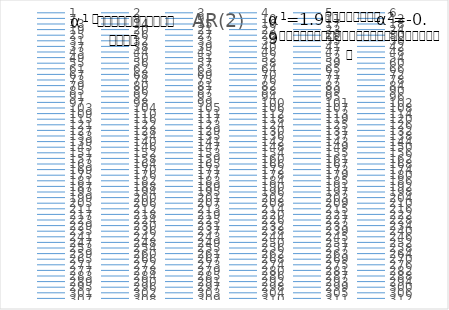
| Category | AR(2)  |
|---|---|
| 0 | 0 |
| 1 | 1.015 |
| 2 | 3.507 |
| 3 | 5.76 |
| 4 | 7.894 |
| 5 | 9.936 |
| 6 | 12.89 |
| 7 | 18.199 |
| 8 | 23.884 |
| 9 | 28.927 |
| 10 | 33.18 |
| 11 | 38.43 |
| 12 | 43.769 |
| 13 | 50.623 |
| 14 | 56.147 |
| 15 | 61.896 |
| 16 | 67.135 |
| 17 | 72.353 |
| 18 | 78.181 |
| 19 | 84.685 |
| 20 | 89.656 |
| 21 | 94.512 |
| 22 | 100.489 |
| 23 | 106.891 |
| 24 | 112.154 |
| 25 | 116.069 |
| 26 | 119.767 |
| 27 | 122.685 |
| 28 | 124.384 |
| 29 | 125.669 |
| 30 | 126.126 |
| 31 | 127.454 |
| 32 | 127.619 |
| 33 | 128.554 |
| 34 | 127.855 |
| 35 | 127.74 |
| 36 | 127.089 |
| 37 | 126.334 |
| 38 | 125.894 |
| 39 | 124.434 |
| 40 | 123.524 |
| 41 | 122.55 |
| 42 | 122.562 |
| 43 | 122.97 |
| 44 | 121.533 |
| 45 | 119.502 |
| 46 | 118.071 |
| 47 | 117.472 |
| 48 | 116.768 |
| 49 | 116.276 |
| 50 | 115.43 |
| 51 | 115.498 |
| 52 | 113.663 |
| 53 | 112.455 |
| 54 | 109.128 |
| 55 | 104.153 |
| 56 | 100.426 |
| 57 | 97.573 |
| 58 | 94.002 |
| 59 | 91.113 |
| 60 | 88.67 |
| 61 | 86.404 |
| 62 | 84.734 |
| 63 | 83.821 |
| 64 | 83.943 |
| 65 | 85.043 |
| 66 | 84.378 |
| 67 | 83.54 |
| 68 | 83.214 |
| 69 | 84.386 |
| 70 | 85.411 |
| 71 | 88.765 |
| 72 | 90.128 |
| 73 | 93.767 |
| 74 | 99.591 |
| 75 | 104.199 |
| 76 | 106.82 |
| 77 | 107.725 |
| 78 | 106.442 |
| 79 | 104.34 |
| 80 | 102.053 |
| 81 | 99.024 |
| 82 | 97.731 |
| 83 | 95.042 |
| 84 | 91.327 |
| 85 | 87.973 |
| 86 | 83.709 |
| 87 | 78.466 |
| 88 | 73.391 |
| 89 | 68.042 |
| 90 | 61.665 |
| 91 | 53.948 |
| 92 | 46.795 |
| 93 | 40.251 |
| 94 | 33.421 |
| 95 | 27.787 |
| 96 | 24.186 |
| 97 | 22.78 |
| 98 | 22.776 |
| 99 | 24.572 |
| 100 | 26.758 |
| 101 | 29.098 |
| 102 | 31.639 |
| 103 | 33.796 |
| 104 | 36.909 |
| 105 | 41.614 |
| 106 | 44.584 |
| 107 | 46.011 |
| 108 | 47.927 |
| 109 | 49.825 |
| 110 | 51.578 |
| 111 | 53.433 |
| 112 | 55.891 |
| 113 | 59.281 |
| 114 | 62.076 |
| 115 | 65.302 |
| 116 | 67.224 |
| 117 | 69.526 |
| 118 | 72.764 |
| 119 | 76.273 |
| 120 | 79.911 |
| 121 | 83.338 |
| 122 | 85.599 |
| 123 | 88.963 |
| 124 | 91.87 |
| 125 | 94.437 |
| 126 | 96.654 |
| 127 | 98.175 |
| 128 | 99.149 |
| 129 | 99.413 |
| 130 | 100.536 |
| 131 | 100.868 |
| 132 | 99.943 |
| 133 | 99.39 |
| 134 | 97.702 |
| 135 | 94.4 |
| 136 | 90.994 |
| 137 | 88.534 |
| 138 | 85.911 |
| 139 | 81.891 |
| 140 | 79.52 |
| 141 | 77.993 |
| 142 | 77.404 |
| 143 | 76.795 |
| 144 | 76.27 |
| 145 | 75.298 |
| 146 | 73.188 |
| 147 | 71.844 |
| 148 | 71.333 |
| 149 | 71.709 |
| 150 | 73.015 |
| 151 | 74.381 |
| 152 | 75.384 |
| 153 | 77.317 |
| 154 | 79.85 |
| 155 | 83.029 |
| 156 | 86.758 |
| 157 | 90.866 |
| 158 | 94.392 |
| 159 | 98.268 |
| 160 | 101.868 |
| 161 | 105.644 |
| 162 | 108.127 |
| 163 | 111.269 |
| 164 | 114.104 |
| 165 | 117.283 |
| 166 | 119.188 |
| 167 | 122.675 |
| 168 | 126.977 |
| 169 | 129.845 |
| 170 | 132.157 |
| 171 | 133.514 |
| 172 | 133.873 |
| 173 | 134.194 |
| 174 | 132.926 |
| 175 | 130.418 |
| 176 | 126.799 |
| 177 | 124.7 |
| 178 | 121.036 |
| 179 | 117.263 |
| 180 | 113.37 |
| 181 | 110.784 |
| 182 | 106.826 |
| 183 | 103.114 |
| 184 | 99.576 |
| 185 | 95.691 |
| 186 | 91.425 |
| 187 | 87.54 |
| 188 | 84.85 |
| 189 | 82.072 |
| 190 | 78.33 |
| 191 | 75.241 |
| 192 | 73.433 |
| 193 | 72.63 |
| 194 | 72.584 |
| 195 | 73.864 |
| 196 | 74.492 |
| 197 | 75.784 |
| 198 | 78.611 |
| 199 | 81.921 |
| 200 | 84.69 |
| 201 | 87.254 |
| 202 | 91.105 |
| 203 | 95.979 |
| 204 | 100.393 |
| 205 | 104.062 |
| 206 | 106.954 |
| 207 | 110.163 |
| 208 | 113.181 |
| 209 | 116.448 |
| 210 | 119.506 |
| 211 | 120.627 |
| 212 | 122.159 |
| 213 | 123.423 |
| 214 | 123.334 |
| 215 | 125.162 |
| 216 | 126.289 |
| 217 | 128.239 |
| 218 | 129.549 |
| 219 | 129.518 |
| 220 | 130.265 |
| 221 | 131.687 |
| 222 | 133.473 |
| 223 | 133.861 |
| 224 | 133.268 |
| 225 | 133.086 |
| 226 | 131.153 |
| 227 | 129.74 |
| 228 | 126.31 |
| 229 | 123.271 |
| 230 | 121.285 |
| 231 | 119.278 |
| 232 | 115.149 |
| 233 | 112.277 |
| 234 | 110.461 |
| 235 | 108.548 |
| 236 | 107.898 |
| 237 | 107.155 |
| 238 | 107.007 |
| 239 | 105.229 |
| 240 | 102.865 |
| 241 | 100.497 |
| 242 | 98.209 |
| 243 | 96.458 |
| 244 | 96.32 |
| 245 | 96.512 |
| 246 | 98.007 |
| 247 | 98.23 |
| 248 | 98.743 |
| 249 | 99.119 |
| 250 | 98.197 |
| 251 | 97.728 |
| 252 | 95.96 |
| 253 | 94.402 |
| 254 | 92.464 |
| 255 | 91.69 |
| 256 | 92.282 |
| 257 | 91.841 |
| 258 | 90.531 |
| 259 | 90.826 |
| 260 | 92.327 |
| 261 | 94.934 |
| 262 | 97.172 |
| 263 | 101.814 |
| 264 | 106.062 |
| 265 | 108.852 |
| 266 | 111.963 |
| 267 | 114.562 |
| 268 | 118.214 |
| 269 | 122.331 |
| 270 | 126.858 |
| 271 | 130.329 |
| 272 | 132.87 |
| 273 | 135.004 |
| 274 | 137.072 |
| 275 | 139.425 |
| 276 | 139.41 |
| 277 | 138.53 |
| 278 | 136.277 |
| 279 | 132.667 |
| 280 | 128.656 |
| 281 | 127.512 |
| 282 | 126.277 |
| 283 | 125.555 |
| 284 | 124.635 |
| 285 | 123.919 |
| 286 | 124.96 |
| 287 | 124.057 |
| 288 | 124.661 |
| 289 | 124.709 |
| 290 | 124.82 |
| 291 | 124.895 |
| 292 | 126.337 |
| 293 | 126.444 |
| 294 | 127.219 |
| 295 | 128.222 |
| 296 | 128.061 |
| 297 | 126.521 |
| 298 | 122.531 |
| 299 | 118.013 |
| 300 | 113.669 |
| 301 | 108.862 |
| 302 | 104.074 |
| 303 | 99.471 |
| 304 | 95.951 |
| 305 | 91.469 |
| 306 | 87.972 |
| 307 | 85.452 |
| 308 | 83.609 |
| 309 | 82.795 |
| 310 | 82.708 |
| 311 | 82.376 |
| 312 | 83.565 |
| 313 | 84.253 |
| 314 | 85.38 |
| 315 | 87.417 |
| 316 | 89.34 |
| 317 | 93.272 |
| 318 | 97.72 |
| 319 | 101.906 |
| 320 | 106.437 |
| 321 | 111.237 |
| 322 | 116.268 |
| 323 | 120.976 |
| 324 | 125.346 |
| 325 | 128.419 |
| 326 | 129.364 |
| 327 | 128.575 |
| 328 | 127.634 |
| 329 | 124.844 |
| 330 | 121.347 |
| 331 | 118.874 |
| 332 | 116.059 |
| 333 | 113.705 |
| 334 | 111.904 |
| 335 | 108.988 |
| 336 | 106.443 |
| 337 | 104.061 |
| 338 | 99.304 |
| 339 | 95.383 |
| 340 | 92.332 |
| 341 | 90.593 |
| 342 | 88.526 |
| 343 | 86.31 |
| 344 | 86.299 |
| 345 | 84.85 |
| 346 | 83.425 |
| 347 | 82.529 |
| 348 | 81.283 |
| 349 | 78.749 |
| 350 | 77.448 |
| 351 | 75.364 |
| 352 | 73.317 |
| 353 | 71.541 |
| 354 | 70.304 |
| 355 | 70.474 |
| 356 | 71.548 |
| 357 | 71.996 |
| 358 | 72.526 |
| 359 | 72.874 |
| 360 | 75.156 |
| 361 | 78.306 |
| 362 | 81.702 |
| 363 | 84.32 |
| 364 | 88.055 |
| 365 | 92.407 |
| 366 | 97.543 |
| 367 | 101.645 |
| 368 | 103.076 |
| 369 | 103.693 |
| 370 | 103.213 |
| 371 | 103.105 |
| 372 | 103.888 |
| 373 | 104.855 |
| 374 | 105.29 |
| 375 | 104.681 |
| 376 | 104.074 |
| 377 | 104.069 |
| 378 | 103.826 |
| 379 | 104.593 |
| 380 | 104.652 |
| 381 | 105.219 |
| 382 | 104.768 |
| 383 | 104.492 |
| 384 | 103.942 |
| 385 | 102.218 |
| 386 | 101.404 |
| 387 | 100.928 |
| 388 | 99.677 |
| 389 | 99.653 |
| 390 | 99.006 |
| 391 | 98.64 |
| 392 | 99.072 |
| 393 | 99.126 |
| 394 | 98.62 |
| 395 | 98.755 |
| 396 | 98.835 |
| 397 | 99.564 |
| 398 | 99.021 |
| 399 | 98.755 |
| 400 | 97.989 |
| 401 | 97.628 |
| 402 | 95.409 |
| 403 | 93.161 |
| 404 | 91.207 |
| 405 | 90.6 |
| 406 | 91.405 |
| 407 | 90.279 |
| 408 | 88.969 |
| 409 | 88.453 |
| 410 | 90.186 |
| 411 | 93.771 |
| 412 | 97.701 |
| 413 | 100.427 |
| 414 | 103.297 |
| 415 | 106.324 |
| 416 | 110.796 |
| 417 | 115.908 |
| 418 | 122.325 |
| 419 | 127.461 |
| 420 | 131.269 |
| 421 | 133.313 |
| 422 | 133.944 |
| 423 | 134.709 |
| 424 | 133.78 |
| 425 | 133.561 |
| 426 | 133.175 |
| 427 | 132.721 |
| 428 | 131.438 |
| 429 | 130.438 |
| 430 | 129.784 |
| 431 | 129.354 |
| 432 | 129.449 |
| 433 | 129.967 |
| 434 | 131.122 |
| 435 | 132.506 |
| 436 | 133.451 |
| 437 | 133.82 |
| 438 | 134.374 |
| 439 | 136.097 |
| 440 | 137.054 |
| 441 | 136.698 |
| 442 | 135.925 |
| 443 | 135.293 |
| 444 | 134.35 |
| 445 | 133.885 |
| 446 | 133.423 |
| 447 | 132.854 |
| 448 | 130.467 |
| 449 | 128.113 |
| 450 | 124.596 |
| 451 | 120.985 |
| 452 | 117.551 |
| 453 | 114.142 |
| 454 | 110.731 |
| 455 | 107.429 |
| 456 | 103.294 |
| 457 | 100.404 |
| 458 | 99.185 |
| 459 | 95.278 |
| 460 | 91.513 |
| 461 | 87.801 |
| 462 | 84.772 |
| 463 | 81.257 |
| 464 | 77.631 |
| 465 | 75.558 |
| 466 | 74.161 |
| 467 | 72.046 |
| 468 | 68.9 |
| 469 | 65.642 |
| 470 | 63.382 |
| 471 | 61.508 |
| 472 | 61.291 |
| 473 | 59.709 |
| 474 | 58.204 |
| 475 | 57.557 |
| 476 | 57.141 |
| 477 | 57.891 |
| 478 | 59.009 |
| 479 | 62.141 |
| 480 | 67.184 |
| 481 | 71.583 |
| 482 | 76.339 |
| 483 | 79.877 |
| 484 | 83.39 |
| 485 | 85.21 |
| 486 | 87.709 |
| 487 | 92.052 |
| 488 | 95.123 |
| 489 | 99.045 |
| 490 | 102.312 |
| 491 | 106.739 |
| 492 | 111.223 |
| 493 | 116.025 |
| 494 | 119.413 |
| 495 | 122.615 |
| 496 | 124.699 |
| 497 | 126.187 |
| 498 | 127.35 |
| 499 | 127.824 |
| 500 | 127.638 |
| 501 | 126.206 |
| 502 | 123.804 |
| 503 | 122.977 |
| 504 | 121.447 |
| 505 | 119.172 |
| 506 | 115.73 |
| 507 | 113.384 |
| 508 | 112.572 |
| 509 | 111.086 |
| 510 | 107.528 |
| 511 | 103.629 |
| 512 | 99.102 |
| 513 | 95.533 |
| 514 | 92.834 |
| 515 | 90.596 |
| 516 | 89.529 |
| 517 | 86.441 |
| 518 | 84.092 |
| 519 | 82.393 |
| 520 | 80.225 |
| 521 | 79.774 |
| 522 | 77.879 |
| 523 | 75.516 |
| 524 | 73.655 |
| 525 | 72.122 |
| 526 | 71.28 |
| 527 | 72.898 |
| 528 | 74.832 |
| 529 | 76.209 |
| 530 | 77.661 |
| 531 | 79.083 |
| 532 | 81.22 |
| 533 | 84.04 |
| 534 | 86.55 |
| 535 | 88.975 |
| 536 | 91.123 |
| 537 | 93.8 |
| 538 | 96.856 |
| 539 | 100.191 |
| 540 | 103.543 |
| 541 | 109.507 |
| 542 | 115.286 |
| 543 | 120.459 |
| 544 | 123.404 |
| 545 | 124.898 |
| 546 | 125.673 |
| 547 | 127.276 |
| 548 | 128.657 |
| 549 | 129.792 |
| 550 | 131.042 |
| 551 | 131.873 |
| 552 | 131.379 |
| 553 | 129.904 |
| 554 | 127.435 |
| 555 | 124.991 |
| 556 | 123.371 |
| 557 | 122.514 |
| 558 | 122.594 |
| 559 | 122.44 |
| 560 | 122.59 |
| 561 | 122.634 |
| 562 | 122.606 |
| 563 | 123.808 |
| 564 | 125.02 |
| 565 | 125.175 |
| 566 | 125.438 |
| 567 | 125.401 |
| 568 | 124.73 |
| 569 | 122.38 |
| 570 | 121.649 |
| 571 | 121.859 |
| 572 | 121.232 |
| 573 | 120.618 |
| 574 | 118.295 |
| 575 | 115.831 |
| 576 | 112.711 |
| 577 | 107.812 |
| 578 | 104.65 |
| 579 | 101.112 |
| 580 | 95.669 |
| 581 | 90.668 |
| 582 | 84.994 |
| 583 | 82.164 |
| 584 | 80.799 |
| 585 | 80.024 |
| 586 | 80.055 |
| 587 | 78.151 |
| 588 | 76.499 |
| 589 | 75.959 |
| 590 | 75.932 |
| 591 | 77.835 |
| 592 | 77.845 |
| 593 | 78.586 |
| 594 | 79.457 |
| 595 | 80.613 |
| 596 | 84.292 |
| 597 | 88.579 |
| 598 | 90.399 |
| 599 | 92.102 |
| 600 | 92.736 |